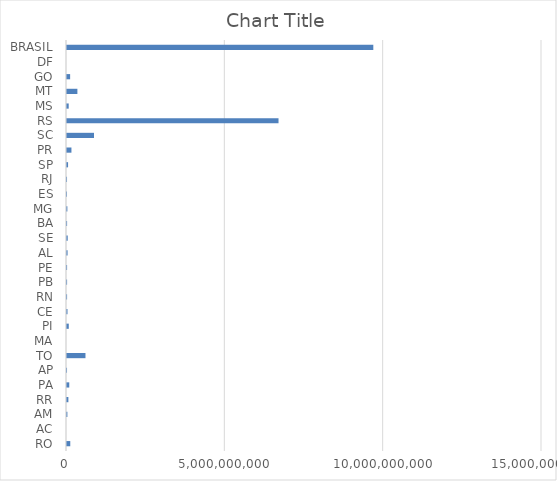
| Category | Series 0 |
|---|---|
| RO | 103347791.289 |
| AC | 0 |
| AM | 12326177.896 |
| RR | 43633600 |
| PA | 71799464 |
| AP | 767023.881 |
| TO | 583316114 |
| MA | 0 |
| PI | 55991611.5 |
| CE | 15709200 |
| RN | 2536211.319 |
| PB | 2734908.681 |
| PE | 2668965.452 |
| AL | 18379939.911 |
| SE | 23182027 |
| BA | 2889000 |
| MG | 11749231.2 |
| ES | 334922.193 |
| RJ | 813682.8 |
| SP | 33737466.667 |
| PR | 140144981.096 |
| SC | 852830940 |
| RS | 6679601291 |
| MS | 53602112.667 |
| MT | 328099914.5 |
| GO | 98836310.667 |
| DF | 0 |
| BRASIL | 9672958993.541 |